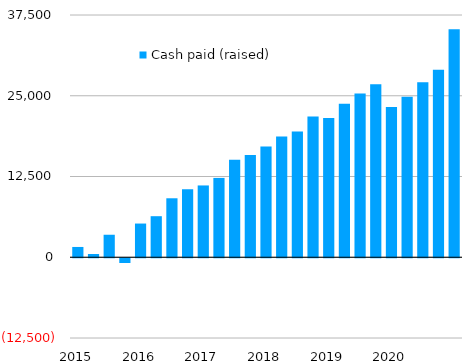
| Category | Cash paid (raised) |
|---|---|
| 2015 | 1593.3 |
|  | 505.7 |
|  | 3484.3 |
|  | -735.3 |
| 2016 | 5217.3 |
|  | 6354.1 |
|  | 9129.8 |
|  | 10527.1 |
| 2017 | 11114.3 |
|  | 12280.8 |
|  | 15090.8 |
|  | 15837.9 |
| 2018 | 17144.1 |
|  | 18708.3 |
|  | 19476.3 |
|  | 21787.5 |
| 2019 | 21566.8 |
|  | 23762.9 |
|  | 25340.5 |
|  | 26782.3 |
| 2020 | 23249.3 |
|  | 24827.2 |
|  | 27096.2 |
|  | 29031.3 |
|  | 35308.98 |